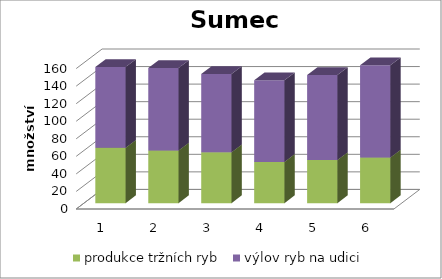
| Category | produkce tržních ryb | výlov ryb na udici |
|---|---|---|
| 0 | 63 | 92 |
| 1 | 60 | 94 |
| 2 | 58 | 89 |
| 3 | 47 | 93 |
| 4 | 49 | 97 |
| 5 | 52 | 105 |